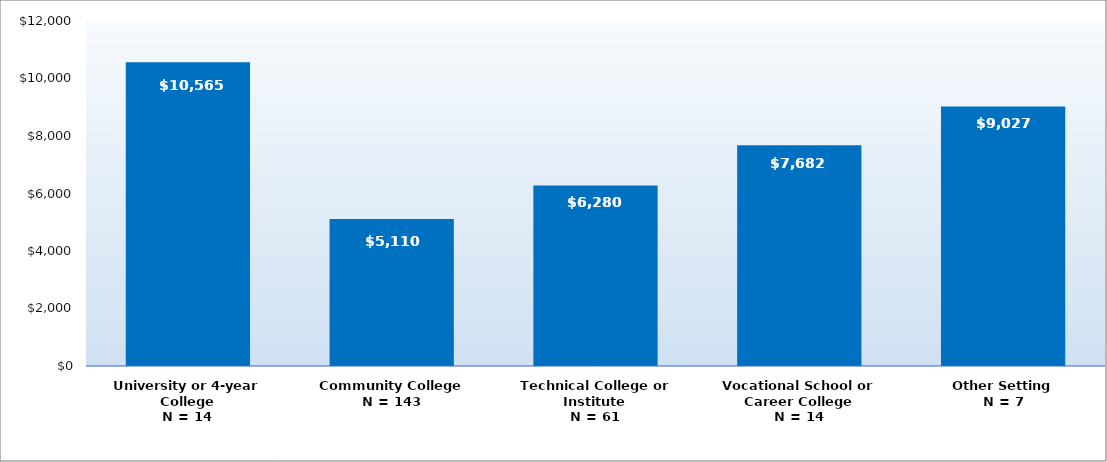
| Category | Series 0 |
|---|---|
| University or 4-year College
N = 14 | 10565 |
| Community College
N = 143 | 5110 |
| Technical College or Institute
N = 61 | 6280 |
| Vocational School or Career College
N = 14 | 7682 |
| Other Setting
N = 7 | 9027 |